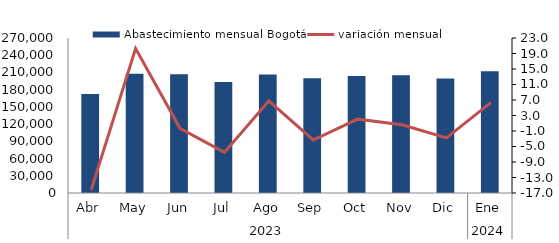
| Category | Abastecimiento mensual Bogotá |
|---|---|
| 0 | 172604.503 |
| 1 | 207645.455 |
| 2 | 207031.626 |
| 3 | 193540.689 |
| 4 | 206595.389 |
| 5 | 199736.721 |
| 6 | 203842.748 |
| 7 | 205049.889 |
| 8 | 199371.331 |
| 9 | 212001.678 |